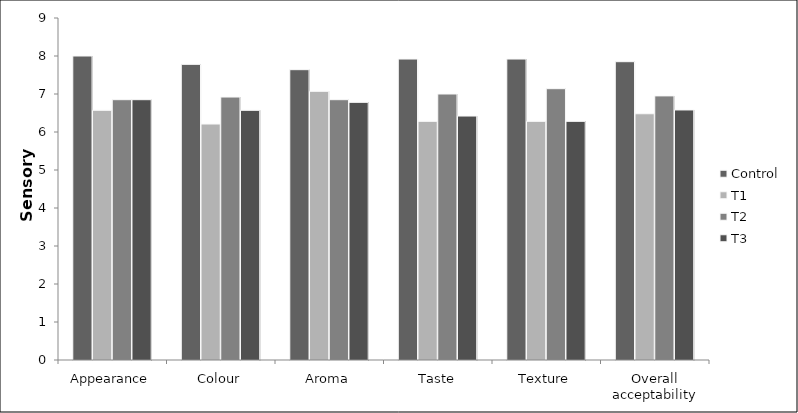
| Category | Control | T1 | T2 | T3 |
|---|---|---|---|---|
| Appearance | 8 | 6.57 | 6.85 | 6.85 |
| Colour | 7.78 | 6.21 | 6.92 | 6.57 |
| Aroma | 7.64 | 7.07 | 6.85 | 6.78 |
| Taste | 7.92 | 6.28 | 7 | 6.42 |
| Texture | 7.92 | 6.28 | 7.14 | 6.28 |
| Overall acceptability | 7.85 | 6.48 | 6.95 | 6.58 |